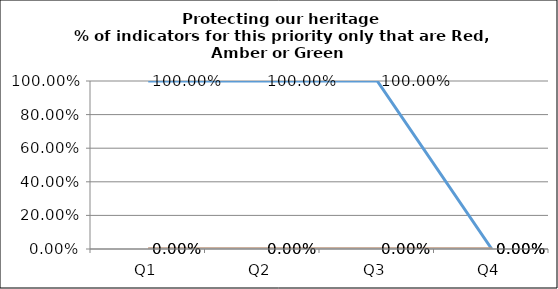
| Category | Green | Amber | Red |
|---|---|---|---|
| Q1 | 1 | 0 | 0 |
| Q2 | 1 | 0 | 0 |
| Q3 | 1 | 0 | 0 |
| Q4 | 0 | 0 | 0 |